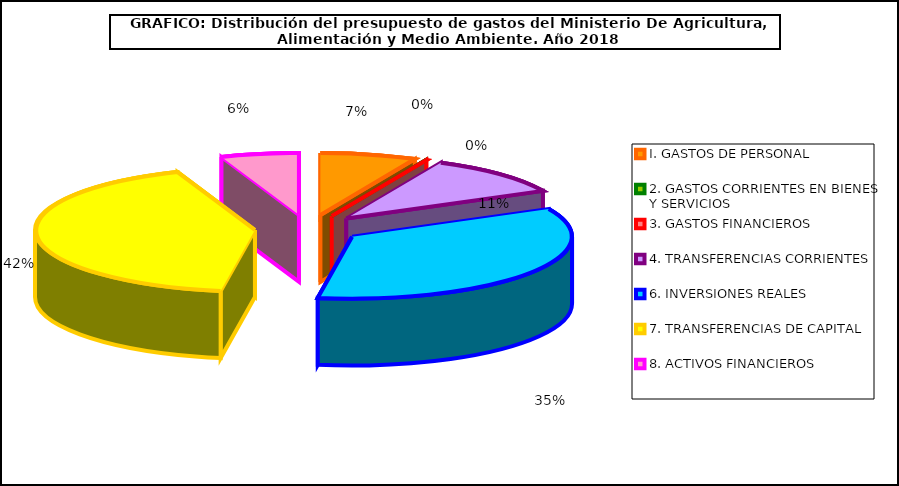
| Category | I. GASTOS DE PERSONAL |
|---|---|
| I. GASTOS DE PERSONAL | 29565780 |
| 2. GASTOS CORRIENTES EN BIENES Y SERVICIOS | 0 |
| 3. GASTOS FINANCIEROS | 55500 |
| 4. TRANSFERENCIAS CORRIENTES | 44115620 |
| 6. INVERSIONES REALES | 146230980 |
| 7. TRANSFERENCIAS DE CAPITAL | 175072410 |
| 8. ACTIVOS FINANCIEROS | 24003320 |